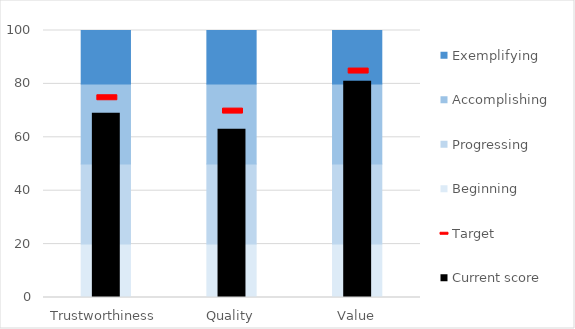
| Category | Beginning | Progressing | Accomplishing | Exemplifying |
|---|---|---|---|---|
| Trustworthiness | 20 | 30 | 30 | 20 |
| Quality | 20 | 30 | 30 | 20 |
| Value | 20 | 30 | 30 | 20 |